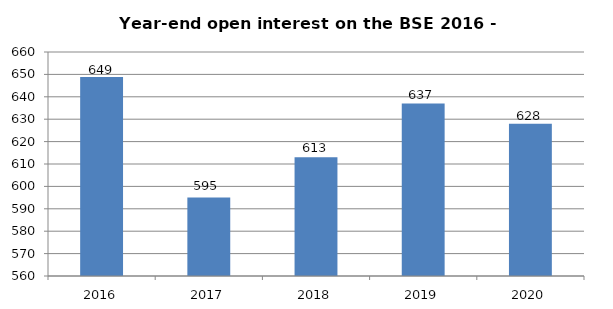
| Category | BSE contracts (thousands) |
|---|---|
| 2016.0 | 648.876 |
| 2017.0 | 595 |
| 2018.0 | 613 |
| 2019.0 | 637 |
| 2020.0 | 628 |